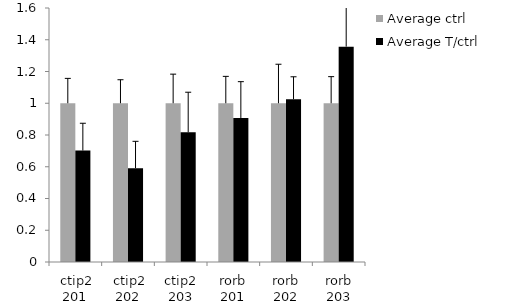
| Category | Average ctrl | Average T/ctrl |
|---|---|---|
|  ctip2 201 | 1 | 0.702 |
|  ctip2 202 | 1 | 0.591 |
| ctip2 203 | 1 | 0.817 |
| rorb 201 | 1 | 0.907 |
| rorb 202 | 1 | 1.025 |
| rorb 203 | 1 | 1.357 |